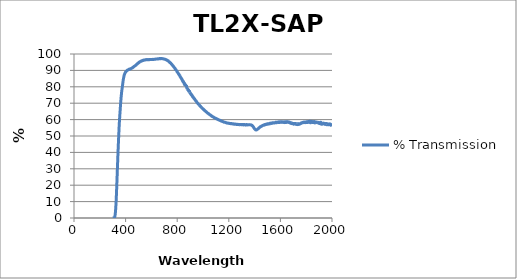
| Category | % Transmission |
|---|---|
| 2000.0 | 56.459 |
| 1999.0 | 56.153 |
| 1998.0 | 57.199 |
| 1997.0 | 56.769 |
| 1996.0 | 56.295 |
| 1995.0 | 56.926 |
| 1994.0 | 56.353 |
| 1993.0 | 56.556 |
| 1992.0 | 56.97 |
| 1991.0 | 56.851 |
| 1990.0 | 56.565 |
| 1989.0 | 57.007 |
| 1988.0 | 56.916 |
| 1987.0 | 56.935 |
| 1986.0 | 57.356 |
| 1985.0 | 56.956 |
| 1984.0 | 56.682 |
| 1983.0 | 57.309 |
| 1982.0 | 57.167 |
| 1981.0 | 57.243 |
| 1980.0 | 57.272 |
| 1979.0 | 57.044 |
| 1978.0 | 56.951 |
| 1977.0 | 57.12 |
| 1976.0 | 56.918 |
| 1975.0 | 57.055 |
| 1974.0 | 57.2 |
| 1973.0 | 57.389 |
| 1972.0 | 56.971 |
| 1971.0 | 56.871 |
| 1970.0 | 57.283 |
| 1969.0 | 57.103 |
| 1968.0 | 57.111 |
| 1967.0 | 57.184 |
| 1966.0 | 56.909 |
| 1965.0 | 57.285 |
| 1964.0 | 57.305 |
| 1963.0 | 57.118 |
| 1962.0 | 57.108 |
| 1961.0 | 57.205 |
| 1960.0 | 57.632 |
| 1959.0 | 57.212 |
| 1958.0 | 57.245 |
| 1957.0 | 56.902 |
| 1956.0 | 57.066 |
| 1955.0 | 57.448 |
| 1954.0 | 57.109 |
| 1953.0 | 57.526 |
| 1952.0 | 57.407 |
| 1951.0 | 57.285 |
| 1950.0 | 58.273 |
| 1949.0 | 57.529 |
| 1948.0 | 57.804 |
| 1947.0 | 57.357 |
| 1946.0 | 57.522 |
| 1945.0 | 57.198 |
| 1944.0 | 57.304 |
| 1943.0 | 57.133 |
| 1942.0 | 57.14 |
| 1941.0 | 57.384 |
| 1940.0 | 57.439 |
| 1939.0 | 57.327 |
| 1938.0 | 57.717 |
| 1937.0 | 57.724 |
| 1936.0 | 57.668 |
| 1935.0 | 57.84 |
| 1934.0 | 57.782 |
| 1933.0 | 56.676 |
| 1932.0 | 57.545 |
| 1931.0 | 57.479 |
| 1930.0 | 57.505 |
| 1929.0 | 58.075 |
| 1928.0 | 58.249 |
| 1927.0 | 57.384 |
| 1926.0 | 57.881 |
| 1925.0 | 57.8 |
| 1924.0 | 56.933 |
| 1923.0 | 57.132 |
| 1922.0 | 57.568 |
| 1921.0 | 57.146 |
| 1920.0 | 57.463 |
| 1919.0 | 57.717 |
| 1918.0 | 57.958 |
| 1917.0 | 57.659 |
| 1916.0 | 58.077 |
| 1915.0 | 57.294 |
| 1914.0 | 58.022 |
| 1913.0 | 58.326 |
| 1912.0 | 57.831 |
| 1911.0 | 57.422 |
| 1910.0 | 57.754 |
| 1909.0 | 57.21 |
| 1908.0 | 58.218 |
| 1907.0 | 58.277 |
| 1906.0 | 57.842 |
| 1905.0 | 57.553 |
| 1904.0 | 57.827 |
| 1903.0 | 57.968 |
| 1902.0 | 58.044 |
| 1901.0 | 58.09 |
| 1900.0 | 57.776 |
| 1899.0 | 58.144 |
| 1898.0 | 58.215 |
| 1897.0 | 57.765 |
| 1896.0 | 58.068 |
| 1895.0 | 58.113 |
| 1894.0 | 58.128 |
| 1893.0 | 58.276 |
| 1892.0 | 58.501 |
| 1891.0 | 57.81 |
| 1890.0 | 58.06 |
| 1889.0 | 58.243 |
| 1888.0 | 58.404 |
| 1887.0 | 58.152 |
| 1886.0 | 58.388 |
| 1885.0 | 58.151 |
| 1884.0 | 58.126 |
| 1883.0 | 58.21 |
| 1882.0 | 58.3 |
| 1881.0 | 58.254 |
| 1880.0 | 58.718 |
| 1879.0 | 57.861 |
| 1878.0 | 57.92 |
| 1877.0 | 58.532 |
| 1876.0 | 58.439 |
| 1875.0 | 58.259 |
| 1874.0 | 58.383 |
| 1873.0 | 58.338 |
| 1872.0 | 58.466 |
| 1871.0 | 58.533 |
| 1870.0 | 58.535 |
| 1869.0 | 58.516 |
| 1868.0 | 58.597 |
| 1867.0 | 57.99 |
| 1866.0 | 58.176 |
| 1865.0 | 58.408 |
| 1864.0 | 58.256 |
| 1863.0 | 58.577 |
| 1862.0 | 58.828 |
| 1861.0 | 58.258 |
| 1860.0 | 58.34 |
| 1859.0 | 58.557 |
| 1858.0 | 58.18 |
| 1857.0 | 58.31 |
| 1856.0 | 58.674 |
| 1855.0 | 58.081 |
| 1854.0 | 58.359 |
| 1853.0 | 58.636 |
| 1852.0 | 58.183 |
| 1851.0 | 58.27 |
| 1850.0 | 58.56 |
| 1849.0 | 58.216 |
| 1848.0 | 58.293 |
| 1847.0 | 58.596 |
| 1846.0 | 58.303 |
| 1845.0 | 58.529 |
| 1844.0 | 58.934 |
| 1843.0 | 58.446 |
| 1842.0 | 58.37 |
| 1841.0 | 58.679 |
| 1840.0 | 58.363 |
| 1839.0 | 58.479 |
| 1838.0 | 58.483 |
| 1837.0 | 58.231 |
| 1836.0 | 58.382 |
| 1835.0 | 58.4 |
| 1834.0 | 58.078 |
| 1833.0 | 58.291 |
| 1832.0 | 58.384 |
| 1831.0 | 58.513 |
| 1830.0 | 58.897 |
| 1829.0 | 59.034 |
| 1828.0 | 58.564 |
| 1827.0 | 58.418 |
| 1826.0 | 58.445 |
| 1825.0 | 58.269 |
| 1824.0 | 58.433 |
| 1823.0 | 58.593 |
| 1822.0 | 58.526 |
| 1821.0 | 58.725 |
| 1820.0 | 58.736 |
| 1819.0 | 58.405 |
| 1818.0 | 58.613 |
| 1817.0 | 58.823 |
| 1816.0 | 58.49 |
| 1815.0 | 58.581 |
| 1814.0 | 58.622 |
| 1813.0 | 58.257 |
| 1812.0 | 58.534 |
| 1811.0 | 58.611 |
| 1810.0 | 58.333 |
| 1809.0 | 58.423 |
| 1808.0 | 58.416 |
| 1807.0 | 58.473 |
| 1806.0 | 58.759 |
| 1805.0 | 58.562 |
| 1804.0 | 58.205 |
| 1803.0 | 58.489 |
| 1802.0 | 58.606 |
| 1801.0 | 58.396 |
| 1800.0 | 58.388 |
| 1799.0 | 58.503 |
| 1798.0 | 58.451 |
| 1797.0 | 58.47 |
| 1796.0 | 58.337 |
| 1795.0 | 58.174 |
| 1794.0 | 58.509 |
| 1793.0 | 58.471 |
| 1792.0 | 58.305 |
| 1791.0 | 58.434 |
| 1790.0 | 58.533 |
| 1789.0 | 58.358 |
| 1788.0 | 58.283 |
| 1787.0 | 58.436 |
| 1786.0 | 58.383 |
| 1785.0 | 58.374 |
| 1784.0 | 58.334 |
| 1783.0 | 58.138 |
| 1782.0 | 58.293 |
| 1781.0 | 58.472 |
| 1780.0 | 58.323 |
| 1779.0 | 58.189 |
| 1778.0 | 58.247 |
| 1777.0 | 58.259 |
| 1776.0 | 58.273 |
| 1775.0 | 58.307 |
| 1774.0 | 58.138 |
| 1773.0 | 58.166 |
| 1772.0 | 58.207 |
| 1771.0 | 58.019 |
| 1770.0 | 58.135 |
| 1769.0 | 58.075 |
| 1768.0 | 57.994 |
| 1767.0 | 57.978 |
| 1766.0 | 58.029 |
| 1765.0 | 57.884 |
| 1764.0 | 58.077 |
| 1763.0 | 57.993 |
| 1762.0 | 57.734 |
| 1761.0 | 57.724 |
| 1760.0 | 57.725 |
| 1759.0 | 57.603 |
| 1758.0 | 57.574 |
| 1757.0 | 57.624 |
| 1756.0 | 57.587 |
| 1755.0 | 57.651 |
| 1754.0 | 57.612 |
| 1753.0 | 57.534 |
| 1752.0 | 57.504 |
| 1751.0 | 57.43 |
| 1750.0 | 57.3 |
| 1749.0 | 57.163 |
| 1748.0 | 57.234 |
| 1747.0 | 57.167 |
| 1746.0 | 57.364 |
| 1745.0 | 57.184 |
| 1744.0 | 57.121 |
| 1743.0 | 57.202 |
| 1742.0 | 57.215 |
| 1741.0 | 57.144 |
| 1740.0 | 57.468 |
| 1739.0 | 57.28 |
| 1738.0 | 57.052 |
| 1737.0 | 57.172 |
| 1736.0 | 57.17 |
| 1735.0 | 57.022 |
| 1734.0 | 57.667 |
| 1733.0 | 57.402 |
| 1732.0 | 57.151 |
| 1731.0 | 57.366 |
| 1730.0 | 57.412 |
| 1729.0 | 56.948 |
| 1728.0 | 57.265 |
| 1727.0 | 57.163 |
| 1726.0 | 57.283 |
| 1725.0 | 57.481 |
| 1724.0 | 57.372 |
| 1723.0 | 57.182 |
| 1722.0 | 57.454 |
| 1721.0 | 57.343 |
| 1720.0 | 57.322 |
| 1719.0 | 57.366 |
| 1718.0 | 57.386 |
| 1717.0 | 57.213 |
| 1716.0 | 57.659 |
| 1715.0 | 57.5 |
| 1714.0 | 57.317 |
| 1713.0 | 57.402 |
| 1712.0 | 57.317 |
| 1711.0 | 57.42 |
| 1710.0 | 57.349 |
| 1709.0 | 57.383 |
| 1708.0 | 57.388 |
| 1707.0 | 57.26 |
| 1706.0 | 57.673 |
| 1705.0 | 57.416 |
| 1704.0 | 57.555 |
| 1703.0 | 57.23 |
| 1702.0 | 57.23 |
| 1701.0 | 57.329 |
| 1700.0 | 57.331 |
| 1699.0 | 57.44 |
| 1698.0 | 57.568 |
| 1697.0 | 57.491 |
| 1696.0 | 57.459 |
| 1695.0 | 57.582 |
| 1694.0 | 57.713 |
| 1693.0 | 57.566 |
| 1692.0 | 57.779 |
| 1691.0 | 57.66 |
| 1690.0 | 57.568 |
| 1689.0 | 57.726 |
| 1688.0 | 57.93 |
| 1687.0 | 57.543 |
| 1686.0 | 57.824 |
| 1685.0 | 57.798 |
| 1684.0 | 57.616 |
| 1683.0 | 57.867 |
| 1682.0 | 58.076 |
| 1681.0 | 57.758 |
| 1680.0 | 58.056 |
| 1679.0 | 58.097 |
| 1678.0 | 58.025 |
| 1677.0 | 57.997 |
| 1676.0 | 58.158 |
| 1675.0 | 57.949 |
| 1674.0 | 58.066 |
| 1673.0 | 58.332 |
| 1672.0 | 58.141 |
| 1671.0 | 58.194 |
| 1670.0 | 58.436 |
| 1669.0 | 58.3 |
| 1668.0 | 58.354 |
| 1667.0 | 58.18 |
| 1666.0 | 58.589 |
| 1665.0 | 58.318 |
| 1664.0 | 58.373 |
| 1663.0 | 58.373 |
| 1662.0 | 58.535 |
| 1661.0 | 58.315 |
| 1660.0 | 58.604 |
| 1659.0 | 58.593 |
| 1658.0 | 58.458 |
| 1657.0 | 58.425 |
| 1656.0 | 58.782 |
| 1655.0 | 58.416 |
| 1654.0 | 58.704 |
| 1653.0 | 58.6 |
| 1652.0 | 58.589 |
| 1651.0 | 58.513 |
| 1650.0 | 58.64 |
| 1649.0 | 58.373 |
| 1648.0 | 58.417 |
| 1647.0 | 58.675 |
| 1646.0 | 58.627 |
| 1645.0 | 58.789 |
| 1644.0 | 58.627 |
| 1643.0 | 58.164 |
| 1642.0 | 58.425 |
| 1641.0 | 58.644 |
| 1640.0 | 58.563 |
| 1639.0 | 58.291 |
| 1638.0 | 58.421 |
| 1637.0 | 58.291 |
| 1636.0 | 58.334 |
| 1635.0 | 58.685 |
| 1634.0 | 58.456 |
| 1633.0 | 58.323 |
| 1632.0 | 58.184 |
| 1631.0 | 58.189 |
| 1630.0 | 58.321 |
| 1629.0 | 58.519 |
| 1628.0 | 58.355 |
| 1627.0 | 58.435 |
| 1626.0 | 58.558 |
| 1625.0 | 58.311 |
| 1624.0 | 58.499 |
| 1623.0 | 58.532 |
| 1622.0 | 58.354 |
| 1621.0 | 58.614 |
| 1620.0 | 58.591 |
| 1619.0 | 58.392 |
| 1618.0 | 58.498 |
| 1617.0 | 58.472 |
| 1616.0 | 58.512 |
| 1615.0 | 58.547 |
| 1614.0 | 58.449 |
| 1613.0 | 58.255 |
| 1612.0 | 58.451 |
| 1611.0 | 58.67 |
| 1610.0 | 58.701 |
| 1609.0 | 58.431 |
| 1608.0 | 58.481 |
| 1607.0 | 58.378 |
| 1606.0 | 58.635 |
| 1605.0 | 58.696 |
| 1604.0 | 58.696 |
| 1603.0 | 58.545 |
| 1602.0 | 58.506 |
| 1601.0 | 58.378 |
| 1600.0 | 58.647 |
| 1599.0 | 58.699 |
| 1598.0 | 58.61 |
| 1597.0 | 58.483 |
| 1596.0 | 58.406 |
| 1595.0 | 58.288 |
| 1594.0 | 58.524 |
| 1593.0 | 58.627 |
| 1592.0 | 58.43 |
| 1591.0 | 58.4 |
| 1590.0 | 58.433 |
| 1589.0 | 58.222 |
| 1588.0 | 58.346 |
| 1587.0 | 58.61 |
| 1586.0 | 58.421 |
| 1585.0 | 58.405 |
| 1584.0 | 58.433 |
| 1583.0 | 58.284 |
| 1582.0 | 58.474 |
| 1581.0 | 58.487 |
| 1580.0 | 58.44 |
| 1579.0 | 58.352 |
| 1578.0 | 58.314 |
| 1577.0 | 58.289 |
| 1576.0 | 58.314 |
| 1575.0 | 58.414 |
| 1574.0 | 58.261 |
| 1573.0 | 58.306 |
| 1572.0 | 58.232 |
| 1571.0 | 58.112 |
| 1570.0 | 58.328 |
| 1569.0 | 58.21 |
| 1568.0 | 58.13 |
| 1567.0 | 58.276 |
| 1566.0 | 58.23 |
| 1565.0 | 58.135 |
| 1564.0 | 58.316 |
| 1563.0 | 58.365 |
| 1562.0 | 58.232 |
| 1561.0 | 58.192 |
| 1560.0 | 58.159 |
| 1559.0 | 58.09 |
| 1558.0 | 58.124 |
| 1557.0 | 58.145 |
| 1556.0 | 58.081 |
| 1555.0 | 58.132 |
| 1554.0 | 58.111 |
| 1553.0 | 57.892 |
| 1552.0 | 58.001 |
| 1551.0 | 58.128 |
| 1550.0 | 57.897 |
| 1549.0 | 57.985 |
| 1548.0 | 57.988 |
| 1547.0 | 57.878 |
| 1546.0 | 58.106 |
| 1545.0 | 58.044 |
| 1544.0 | 58.018 |
| 1543.0 | 58.044 |
| 1542.0 | 58.073 |
| 1541.0 | 57.911 |
| 1540.0 | 58.02 |
| 1539.0 | 58.044 |
| 1538.0 | 57.909 |
| 1537.0 | 57.877 |
| 1536.0 | 57.876 |
| 1535.0 | 57.728 |
| 1534.0 | 57.954 |
| 1533.0 | 57.954 |
| 1532.0 | 57.882 |
| 1531.0 | 57.816 |
| 1530.0 | 57.854 |
| 1529.0 | 57.609 |
| 1528.0 | 57.819 |
| 1527.0 | 57.884 |
| 1526.0 | 57.785 |
| 1525.0 | 57.687 |
| 1524.0 | 57.667 |
| 1523.0 | 57.517 |
| 1522.0 | 57.725 |
| 1521.0 | 57.734 |
| 1520.0 | 57.639 |
| 1519.0 | 57.676 |
| 1518.0 | 57.718 |
| 1517.0 | 57.535 |
| 1516.0 | 57.597 |
| 1515.0 | 57.635 |
| 1514.0 | 57.607 |
| 1513.0 | 57.544 |
| 1512.0 | 57.539 |
| 1511.0 | 57.343 |
| 1510.0 | 57.49 |
| 1509.0 | 57.503 |
| 1508.0 | 57.5 |
| 1507.0 | 57.467 |
| 1506.0 | 57.503 |
| 1505.0 | 57.377 |
| 1504.0 | 57.47 |
| 1503.0 | 57.497 |
| 1502.0 | 57.402 |
| 1501.0 | 57.445 |
| 1500.0 | 57.315 |
| 1499.0 | 57.141 |
| 1498.0 | 57.376 |
| 1497.0 | 57.406 |
| 1496.0 | 57.37 |
| 1495.0 | 57.279 |
| 1494.0 | 57.174 |
| 1493.0 | 57.128 |
| 1492.0 | 57.317 |
| 1491.0 | 57.236 |
| 1490.0 | 57.155 |
| 1489.0 | 57.176 |
| 1488.0 | 57.03 |
| 1487.0 | 56.884 |
| 1486.0 | 57.039 |
| 1485.0 | 57.106 |
| 1484.0 | 57.033 |
| 1483.0 | 57.066 |
| 1482.0 | 56.95 |
| 1481.0 | 56.85 |
| 1480.0 | 57.023 |
| 1479.0 | 56.961 |
| 1478.0 | 56.864 |
| 1477.0 | 56.911 |
| 1476.0 | 56.795 |
| 1475.0 | 56.623 |
| 1474.0 | 56.732 |
| 1473.0 | 56.711 |
| 1472.0 | 56.648 |
| 1471.0 | 56.715 |
| 1470.0 | 56.698 |
| 1469.0 | 56.647 |
| 1468.0 | 56.647 |
| 1467.0 | 56.569 |
| 1466.0 | 56.536 |
| 1465.0 | 56.552 |
| 1464.0 | 56.446 |
| 1463.0 | 56.34 |
| 1462.0 | 56.398 |
| 1461.0 | 56.354 |
| 1460.0 | 56.306 |
| 1459.0 | 56.194 |
| 1458.0 | 56.129 |
| 1457.0 | 56.048 |
| 1456.0 | 56.169 |
| 1455.0 | 56.147 |
| 1454.0 | 56.065 |
| 1453.0 | 56.05 |
| 1452.0 | 55.912 |
| 1451.0 | 55.813 |
| 1450.0 | 55.872 |
| 1449.0 | 55.813 |
| 1448.0 | 55.764 |
| 1447.0 | 55.726 |
| 1446.0 | 55.588 |
| 1445.0 | 55.592 |
| 1444.0 | 55.691 |
| 1443.0 | 55.607 |
| 1442.0 | 55.464 |
| 1441.0 | 55.376 |
| 1440.0 | 55.241 |
| 1439.0 | 55.171 |
| 1438.0 | 55.261 |
| 1437.0 | 55.207 |
| 1436.0 | 55.072 |
| 1435.0 | 54.981 |
| 1434.0 | 54.793 |
| 1433.0 | 54.77 |
| 1432.0 | 54.847 |
| 1431.0 | 54.73 |
| 1430.0 | 54.609 |
| 1429.0 | 54.563 |
| 1428.0 | 54.444 |
| 1427.0 | 54.379 |
| 1426.0 | 54.367 |
| 1425.0 | 54.32 |
| 1424.0 | 54.205 |
| 1423.0 | 54.137 |
| 1422.0 | 54.031 |
| 1421.0 | 53.979 |
| 1420.0 | 54.004 |
| 1419.0 | 53.961 |
| 1418.0 | 53.887 |
| 1417.0 | 53.856 |
| 1416.0 | 53.773 |
| 1415.0 | 53.863 |
| 1414.0 | 53.834 |
| 1413.0 | 53.672 |
| 1412.0 | 53.717 |
| 1411.0 | 53.767 |
| 1410.0 | 53.678 |
| 1409.0 | 53.791 |
| 1408.0 | 53.769 |
| 1407.0 | 53.769 |
| 1406.0 | 53.918 |
| 1405.0 | 53.995 |
| 1404.0 | 53.994 |
| 1403.0 | 54.101 |
| 1402.0 | 54.19 |
| 1401.0 | 54.249 |
| 1400.0 | 54.315 |
| 1399.0 | 54.499 |
| 1398.0 | 54.503 |
| 1397.0 | 54.708 |
| 1396.0 | 54.924 |
| 1395.0 | 54.924 |
| 1394.0 | 55.026 |
| 1393.0 | 55.203 |
| 1392.0 | 55.246 |
| 1391.0 | 55.459 |
| 1390.0 | 55.576 |
| 1389.0 | 55.625 |
| 1388.0 | 55.818 |
| 1387.0 | 55.912 |
| 1386.0 | 55.892 |
| 1385.0 | 56.132 |
| 1384.0 | 56.197 |
| 1383.0 | 56.181 |
| 1382.0 | 56.243 |
| 1381.0 | 56.37 |
| 1380.0 | 56.388 |
| 1379.0 | 56.579 |
| 1378.0 | 56.569 |
| 1377.0 | 56.579 |
| 1376.0 | 56.653 |
| 1375.0 | 56.688 |
| 1374.0 | 56.635 |
| 1373.0 | 56.636 |
| 1372.0 | 56.706 |
| 1371.0 | 56.803 |
| 1370.0 | 56.811 |
| 1369.0 | 56.822 |
| 1368.0 | 56.762 |
| 1367.0 | 56.79 |
| 1366.0 | 56.886 |
| 1365.0 | 56.85 |
| 1364.0 | 56.812 |
| 1363.0 | 56.803 |
| 1362.0 | 56.832 |
| 1361.0 | 56.944 |
| 1360.0 | 56.817 |
| 1359.0 | 56.83 |
| 1358.0 | 56.87 |
| 1357.0 | 56.871 |
| 1356.0 | 56.81 |
| 1355.0 | 56.923 |
| 1354.0 | 56.882 |
| 1353.0 | 56.782 |
| 1352.0 | 56.869 |
| 1351.0 | 56.861 |
| 1350.0 | 56.753 |
| 1349.0 | 56.861 |
| 1348.0 | 56.877 |
| 1347.0 | 56.765 |
| 1346.0 | 56.777 |
| 1345.0 | 56.822 |
| 1344.0 | 56.778 |
| 1343.0 | 56.841 |
| 1342.0 | 56.841 |
| 1341.0 | 56.919 |
| 1340.0 | 56.904 |
| 1339.0 | 56.967 |
| 1338.0 | 57.013 |
| 1337.0 | 57.027 |
| 1336.0 | 56.906 |
| 1335.0 | 56.831 |
| 1334.0 | 56.653 |
| 1333.0 | 56.646 |
| 1332.0 | 56.638 |
| 1331.0 | 56.764 |
| 1330.0 | 56.806 |
| 1329.0 | 56.729 |
| 1328.0 | 56.742 |
| 1327.0 | 56.807 |
| 1326.0 | 56.78 |
| 1325.0 | 56.856 |
| 1324.0 | 56.844 |
| 1323.0 | 56.864 |
| 1322.0 | 57.01 |
| 1321.0 | 56.989 |
| 1320.0 | 56.899 |
| 1319.0 | 56.878 |
| 1318.0 | 56.895 |
| 1317.0 | 56.894 |
| 1316.0 | 56.75 |
| 1315.0 | 56.964 |
| 1314.0 | 56.803 |
| 1313.0 | 56.861 |
| 1312.0 | 56.871 |
| 1311.0 | 56.876 |
| 1310.0 | 56.915 |
| 1309.0 | 56.982 |
| 1308.0 | 56.887 |
| 1307.0 | 56.928 |
| 1306.0 | 56.899 |
| 1305.0 | 56.949 |
| 1304.0 | 56.978 |
| 1303.0 | 56.902 |
| 1302.0 | 56.877 |
| 1301.0 | 56.918 |
| 1300.0 | 56.925 |
| 1299.0 | 56.978 |
| 1298.0 | 56.889 |
| 1297.0 | 56.928 |
| 1296.0 | 56.929 |
| 1295.0 | 56.974 |
| 1294.0 | 57.03 |
| 1293.0 | 57.02 |
| 1292.0 | 57.025 |
| 1291.0 | 57.018 |
| 1290.0 | 56.93 |
| 1289.0 | 57.023 |
| 1288.0 | 56.904 |
| 1287.0 | 56.912 |
| 1286.0 | 56.881 |
| 1285.0 | 56.846 |
| 1284.0 | 56.87 |
| 1283.0 | 56.938 |
| 1282.0 | 56.969 |
| 1281.0 | 56.949 |
| 1280.0 | 56.978 |
| 1279.0 | 57.032 |
| 1278.0 | 56.992 |
| 1277.0 | 56.992 |
| 1276.0 | 57.082 |
| 1275.0 | 57.048 |
| 1274.0 | 56.939 |
| 1273.0 | 57.085 |
| 1272.0 | 56.935 |
| 1271.0 | 57.066 |
| 1270.0 | 57.059 |
| 1269.0 | 57.05 |
| 1268.0 | 57.105 |
| 1267.0 | 57.1 |
| 1266.0 | 57.063 |
| 1265.0 | 57.11 |
| 1264.0 | 57.106 |
| 1263.0 | 57.054 |
| 1262.0 | 57.148 |
| 1261.0 | 57.077 |
| 1260.0 | 57.101 |
| 1259.0 | 57.088 |
| 1258.0 | 57.078 |
| 1257.0 | 57.077 |
| 1256.0 | 57.201 |
| 1255.0 | 57.138 |
| 1254.0 | 57.172 |
| 1253.0 | 57.217 |
| 1252.0 | 57.245 |
| 1251.0 | 57.158 |
| 1250.0 | 57.238 |
| 1249.0 | 57.172 |
| 1248.0 | 57.117 |
| 1247.0 | 57.25 |
| 1246.0 | 57.176 |
| 1245.0 | 57.217 |
| 1244.0 | 57.212 |
| 1243.0 | 57.369 |
| 1242.0 | 57.169 |
| 1241.0 | 57.306 |
| 1240.0 | 57.287 |
| 1239.0 | 57.207 |
| 1238.0 | 57.32 |
| 1237.0 | 57.374 |
| 1236.0 | 57.301 |
| 1235.0 | 57.42 |
| 1234.0 | 57.349 |
| 1233.0 | 57.308 |
| 1232.0 | 57.38 |
| 1231.0 | 57.454 |
| 1230.0 | 57.325 |
| 1229.0 | 57.43 |
| 1228.0 | 57.407 |
| 1227.0 | 57.389 |
| 1226.0 | 57.417 |
| 1225.0 | 57.545 |
| 1224.0 | 57.487 |
| 1223.0 | 57.586 |
| 1222.0 | 57.543 |
| 1221.0 | 57.561 |
| 1220.0 | 57.646 |
| 1219.0 | 57.547 |
| 1218.0 | 57.498 |
| 1217.0 | 57.58 |
| 1216.0 | 57.485 |
| 1215.0 | 57.524 |
| 1214.0 | 57.513 |
| 1213.0 | 57.586 |
| 1212.0 | 57.586 |
| 1211.0 | 57.633 |
| 1210.0 | 57.563 |
| 1209.0 | 57.674 |
| 1208.0 | 57.595 |
| 1207.0 | 57.697 |
| 1206.0 | 57.602 |
| 1205.0 | 57.73 |
| 1204.0 | 57.637 |
| 1203.0 | 57.643 |
| 1202.0 | 57.775 |
| 1201.0 | 57.78 |
| 1200.0 | 57.722 |
| 1199.0 | 57.778 |
| 1198.0 | 57.769 |
| 1197.0 | 57.815 |
| 1196.0 | 57.746 |
| 1195.0 | 57.835 |
| 1194.0 | 57.797 |
| 1193.0 | 57.862 |
| 1192.0 | 57.972 |
| 1191.0 | 57.918 |
| 1190.0 | 57.956 |
| 1189.0 | 57.929 |
| 1188.0 | 57.964 |
| 1187.0 | 57.948 |
| 1186.0 | 57.984 |
| 1185.0 | 58.007 |
| 1184.0 | 57.997 |
| 1183.0 | 58.038 |
| 1182.0 | 57.997 |
| 1181.0 | 57.976 |
| 1180.0 | 58.09 |
| 1179.0 | 58.1 |
| 1178.0 | 58.121 |
| 1177.0 | 58.185 |
| 1176.0 | 58.244 |
| 1175.0 | 58.22 |
| 1174.0 | 58.281 |
| 1173.0 | 58.298 |
| 1172.0 | 58.32 |
| 1171.0 | 58.311 |
| 1170.0 | 58.351 |
| 1169.0 | 58.323 |
| 1168.0 | 58.432 |
| 1167.0 | 58.413 |
| 1166.0 | 58.401 |
| 1165.0 | 58.433 |
| 1164.0 | 58.497 |
| 1163.0 | 58.442 |
| 1162.0 | 58.509 |
| 1161.0 | 58.454 |
| 1160.0 | 58.569 |
| 1159.0 | 58.641 |
| 1158.0 | 58.662 |
| 1157.0 | 58.604 |
| 1156.0 | 58.726 |
| 1155.0 | 58.798 |
| 1154.0 | 58.805 |
| 1153.0 | 58.811 |
| 1152.0 | 58.769 |
| 1151.0 | 58.791 |
| 1150.0 | 58.937 |
| 1149.0 | 59.011 |
| 1148.0 | 59.003 |
| 1147.0 | 59.021 |
| 1146.0 | 59.028 |
| 1145.0 | 59.001 |
| 1144.0 | 59.041 |
| 1143.0 | 59.109 |
| 1142.0 | 59.146 |
| 1141.0 | 59.164 |
| 1140.0 | 59.204 |
| 1139.0 | 59.178 |
| 1138.0 | 59.315 |
| 1137.0 | 59.427 |
| 1136.0 | 59.448 |
| 1135.0 | 59.47 |
| 1134.0 | 59.403 |
| 1133.0 | 59.405 |
| 1132.0 | 59.457 |
| 1131.0 | 59.545 |
| 1130.0 | 59.618 |
| 1129.0 | 59.647 |
| 1128.0 | 59.565 |
| 1127.0 | 59.6 |
| 1126.0 | 59.734 |
| 1125.0 | 59.784 |
| 1124.0 | 59.822 |
| 1123.0 | 59.805 |
| 1122.0 | 59.812 |
| 1121.0 | 59.919 |
| 1120.0 | 59.951 |
| 1119.0 | 59.948 |
| 1118.0 | 59.991 |
| 1117.0 | 60.022 |
| 1116.0 | 60.081 |
| 1115.0 | 60.146 |
| 1114.0 | 60.168 |
| 1113.0 | 60.144 |
| 1112.0 | 60.225 |
| 1111.0 | 60.245 |
| 1110.0 | 60.227 |
| 1109.0 | 60.349 |
| 1108.0 | 60.426 |
| 1107.0 | 60.378 |
| 1106.0 | 60.457 |
| 1105.0 | 60.531 |
| 1104.0 | 60.562 |
| 1103.0 | 60.619 |
| 1102.0 | 60.704 |
| 1101.0 | 60.655 |
| 1100.0 | 60.674 |
| 1099.0 | 60.726 |
| 1098.0 | 60.717 |
| 1097.0 | 60.818 |
| 1096.0 | 60.867 |
| 1095.0 | 60.845 |
| 1094.0 | 60.936 |
| 1093.0 | 60.96 |
| 1092.0 | 60.976 |
| 1091.0 | 61.065 |
| 1090.0 | 61.139 |
| 1089.0 | 61.146 |
| 1088.0 | 61.223 |
| 1087.0 | 61.259 |
| 1086.0 | 61.236 |
| 1085.0 | 61.277 |
| 1084.0 | 61.327 |
| 1083.0 | 61.414 |
| 1082.0 | 61.527 |
| 1081.0 | 61.505 |
| 1080.0 | 61.47 |
| 1079.0 | 61.532 |
| 1078.0 | 61.661 |
| 1077.0 | 61.732 |
| 1076.0 | 61.778 |
| 1075.0 | 61.831 |
| 1074.0 | 61.89 |
| 1073.0 | 61.858 |
| 1072.0 | 61.903 |
| 1071.0 | 62.012 |
| 1070.0 | 61.967 |
| 1069.0 | 61.973 |
| 1068.0 | 62.149 |
| 1067.0 | 62.27 |
| 1066.0 | 62.313 |
| 1065.0 | 62.371 |
| 1064.0 | 62.408 |
| 1063.0 | 62.449 |
| 1062.0 | 62.494 |
| 1061.0 | 62.61 |
| 1060.0 | 62.679 |
| 1059.0 | 62.672 |
| 1058.0 | 62.696 |
| 1057.0 | 62.748 |
| 1056.0 | 62.75 |
| 1055.0 | 62.836 |
| 1054.0 | 62.938 |
| 1053.0 | 63.016 |
| 1052.0 | 63.075 |
| 1051.0 | 63.038 |
| 1050.0 | 63.092 |
| 1049.0 | 63.217 |
| 1048.0 | 63.332 |
| 1047.0 | 63.368 |
| 1046.0 | 63.444 |
| 1045.0 | 63.468 |
| 1044.0 | 63.477 |
| 1043.0 | 63.65 |
| 1042.0 | 63.706 |
| 1041.0 | 63.707 |
| 1040.0 | 63.77 |
| 1039.0 | 63.861 |
| 1038.0 | 63.864 |
| 1037.0 | 63.942 |
| 1036.0 | 63.994 |
| 1035.0 | 63.998 |
| 1034.0 | 64.138 |
| 1033.0 | 64.189 |
| 1032.0 | 64.228 |
| 1031.0 | 64.357 |
| 1030.0 | 64.458 |
| 1029.0 | 64.456 |
| 1028.0 | 64.526 |
| 1027.0 | 64.599 |
| 1026.0 | 64.6 |
| 1025.0 | 64.789 |
| 1024.0 | 64.818 |
| 1023.0 | 64.818 |
| 1022.0 | 64.892 |
| 1021.0 | 64.946 |
| 1020.0 | 64.956 |
| 1019.0 | 65.159 |
| 1018.0 | 65.221 |
| 1017.0 | 65.253 |
| 1016.0 | 65.387 |
| 1015.0 | 65.445 |
| 1014.0 | 65.375 |
| 1013.0 | 65.506 |
| 1012.0 | 65.612 |
| 1011.0 | 65.72 |
| 1010.0 | 65.852 |
| 1009.0 | 65.897 |
| 1008.0 | 65.845 |
| 1007.0 | 66.039 |
| 1006.0 | 66.097 |
| 1005.0 | 66.072 |
| 1004.0 | 66.16 |
| 1003.0 | 66.165 |
| 1002.0 | 66.288 |
| 1001.0 | 66.549 |
| 1000.0 | 66.554 |
| 999.0 | 66.498 |
| 998.0 | 66.663 |
| 997.0 | 66.778 |
| 996.0 | 66.72 |
| 995.0 | 66.938 |
| 994.0 | 66.966 |
| 993.0 | 67.051 |
| 992.0 | 67.135 |
| 991.0 | 67.224 |
| 990.0 | 67.218 |
| 989.0 | 67.419 |
| 988.0 | 67.494 |
| 987.0 | 67.524 |
| 986.0 | 67.617 |
| 985.0 | 67.662 |
| 984.0 | 67.732 |
| 983.0 | 67.892 |
| 982.0 | 67.9 |
| 981.0 | 67.946 |
| 980.0 | 68.174 |
| 979.0 | 68.158 |
| 978.0 | 68.174 |
| 977.0 | 68.503 |
| 976.0 | 68.463 |
| 975.0 | 68.426 |
| 974.0 | 68.58 |
| 973.0 | 68.565 |
| 972.0 | 68.725 |
| 971.0 | 68.909 |
| 970.0 | 68.963 |
| 969.0 | 68.99 |
| 968.0 | 69.173 |
| 967.0 | 69.127 |
| 966.0 | 69.273 |
| 965.0 | 69.381 |
| 964.0 | 69.44 |
| 963.0 | 69.506 |
| 962.0 | 69.747 |
| 961.0 | 69.739 |
| 960.0 | 69.741 |
| 959.0 | 70.04 |
| 958.0 | 70.05 |
| 957.0 | 70.144 |
| 956.0 | 70.279 |
| 955.0 | 70.329 |
| 954.0 | 70.37 |
| 953.0 | 70.662 |
| 952.0 | 70.632 |
| 951.0 | 70.687 |
| 950.0 | 71.099 |
| 949.0 | 70.874 |
| 948.0 | 70.994 |
| 947.0 | 71.345 |
| 946.0 | 71.324 |
| 945.0 | 71.315 |
| 944.0 | 71.423 |
| 943.0 | 71.54 |
| 942.0 | 71.548 |
| 941.0 | 71.757 |
| 940.0 | 71.98 |
| 939.0 | 71.911 |
| 938.0 | 72.239 |
| 937.0 | 72.361 |
| 936.0 | 72.352 |
| 935.0 | 72.65 |
| 934.0 | 72.449 |
| 933.0 | 72.711 |
| 932.0 | 72.952 |
| 931.0 | 72.762 |
| 930.0 | 72.831 |
| 929.0 | 73.135 |
| 928.0 | 73.172 |
| 927.0 | 73.174 |
| 926.0 | 73.473 |
| 925.0 | 73.383 |
| 924.0 | 73.901 |
| 923.0 | 73.8 |
| 922.0 | 73.716 |
| 921.0 | 73.663 |
| 920.0 | 74.073 |
| 919.0 | 74.255 |
| 918.0 | 74.144 |
| 917.0 | 74.49 |
| 916.0 | 74.661 |
| 915.0 | 74.454 |
| 914.0 | 75.02 |
| 913.0 | 74.523 |
| 912.0 | 75.06 |
| 911.0 | 75.689 |
| 910.0 | 75.138 |
| 909.0 | 75.328 |
| 908.0 | 75.449 |
| 907.0 | 75.251 |
| 906.0 | 75.543 |
| 905.0 | 75.802 |
| 904.0 | 75.728 |
| 903.0 | 75.827 |
| 902.0 | 76.344 |
| 901.0 | 76.262 |
| 900.0 | 76.314 |
| 899.0 | 76.176 |
| 898.0 | 76.486 |
| 897.0 | 76.703 |
| 896.0 | 77.234 |
| 895.0 | 77.029 |
| 894.0 | 76.606 |
| 893.0 | 77.398 |
| 892.0 | 77.26 |
| 891.0 | 77.452 |
| 890.0 | 77.517 |
| 889.0 | 77.39 |
| 888.0 | 77.586 |
| 887.0 | 78.504 |
| 886.0 | 77.906 |
| 885.0 | 77.78 |
| 884.0 | 78.811 |
| 883.0 | 78.547 |
| 882.0 | 78.25 |
| 881.0 | 78.658 |
| 880.0 | 78.488 |
| 879.0 | 79.278 |
| 878.0 | 79.207 |
| 877.0 | 78.662 |
| 876.0 | 78.929 |
| 875.0 | 78.857 |
| 874.0 | 79.753 |
| 873.0 | 80.078 |
| 872.0 | 79.695 |
| 871.0 | 80.892 |
| 870.0 | 80.025 |
| 869.0 | 80.203 |
| 868.0 | 80.582 |
| 867.0 | 80.893 |
| 866.0 | 80.438 |
| 865.0 | 81.355 |
| 864.0 | 80.825 |
| 863.0 | 81.014 |
| 862.0 | 81.461 |
| 861.0 | 80.708 |
| 860.0 | 81.77 |
| 859.0 | 81.457 |
| 858.0 | 81.876 |
| 857.0 | 82.003 |
| 856.0 | 82.067 |
| 855.0 | 82.277 |
| 854.0 | 81.927 |
| 853.0 | 82.099 |
| 852.0 | 82.346 |
| 851.0 | 82.469 |
| 850.0 | 82.662 |
| 849.0 | 83.007 |
| 848.0 | 82.841 |
| 847.0 | 83.387 |
| 846.0 | 83.027 |
| 845.0 | 83.451 |
| 844.0 | 83.6 |
| 843.0 | 83.372 |
| 842.0 | 83.902 |
| 841.0 | 83.766 |
| 840.0 | 84.054 |
| 839.0 | 84.141 |
| 838.0 | 84.225 |
| 837.0 | 84.602 |
| 836.0 | 84.46 |
| 835.0 | 84.684 |
| 834.0 | 84.764 |
| 833.0 | 84.913 |
| 832.0 | 85.296 |
| 831.0 | 85.149 |
| 830.0 | 85.468 |
| 829.0 | 85.431 |
| 828.0 | 85.54 |
| 827.0 | 85.592 |
| 826.0 | 85.915 |
| 825.0 | 85.913 |
| 824.0 | 86.038 |
| 823.0 | 86.285 |
| 822.0 | 86.397 |
| 821.0 | 86.631 |
| 820.0 | 86.928 |
| 819.0 | 86.883 |
| 818.0 | 86.856 |
| 817.0 | 87.241 |
| 816.0 | 87.385 |
| 815.0 | 87.277 |
| 814.0 | 87.627 |
| 813.0 | 87.581 |
| 812.0 | 87.707 |
| 811.0 | 87.777 |
| 810.0 | 87.792 |
| 809.0 | 88.084 |
| 808.0 | 88.128 |
| 807.0 | 88.349 |
| 806.0 | 88.41 |
| 805.0 | 88.413 |
| 804.0 | 88.622 |
| 803.0 | 88.75 |
| 802.0 | 88.972 |
| 801.0 | 88.938 |
| 800.0 | 89.2 |
| 799.0 | 89.105 |
| 798.0 | 89.492 |
| 797.0 | 89.645 |
| 796.0 | 89.702 |
| 795.0 | 89.886 |
| 794.0 | 89.933 |
| 793.0 | 90.034 |
| 792.0 | 90.166 |
| 791.0 | 90.158 |
| 790.0 | 90.41 |
| 789.0 | 90.519 |
| 788.0 | 90.588 |
| 787.0 | 90.686 |
| 786.0 | 90.81 |
| 785.0 | 90.979 |
| 784.0 | 91.249 |
| 783.0 | 90.993 |
| 782.0 | 91.207 |
| 781.0 | 91.454 |
| 780.0 | 91.606 |
| 779.0 | 91.626 |
| 778.0 | 91.679 |
| 777.0 | 91.774 |
| 776.0 | 91.869 |
| 775.0 | 91.987 |
| 774.0 | 92.038 |
| 773.0 | 92.236 |
| 772.0 | 92.27 |
| 771.0 | 92.352 |
| 770.0 | 92.432 |
| 769.0 | 92.527 |
| 768.0 | 92.832 |
| 767.0 | 92.862 |
| 766.0 | 92.93 |
| 765.0 | 92.983 |
| 764.0 | 93.001 |
| 763.0 | 93.245 |
| 762.0 | 93.337 |
| 761.0 | 93.399 |
| 760.0 | 93.517 |
| 759.0 | 93.563 |
| 758.0 | 93.57 |
| 757.0 | 93.833 |
| 756.0 | 93.888 |
| 755.0 | 93.9 |
| 754.0 | 93.966 |
| 753.0 | 94.022 |
| 752.0 | 94.147 |
| 751.0 | 94.228 |
| 750.0 | 94.379 |
| 749.0 | 94.557 |
| 748.0 | 94.54 |
| 747.0 | 94.545 |
| 746.0 | 94.689 |
| 745.0 | 94.668 |
| 744.0 | 94.727 |
| 743.0 | 94.887 |
| 742.0 | 94.848 |
| 741.0 | 95.044 |
| 740.0 | 95.12 |
| 739.0 | 95.119 |
| 738.0 | 95.149 |
| 737.0 | 95.273 |
| 736.0 | 95.398 |
| 735.0 | 95.403 |
| 734.0 | 95.433 |
| 733.0 | 95.584 |
| 732.0 | 95.566 |
| 731.0 | 95.715 |
| 730.0 | 95.89 |
| 729.0 | 95.843 |
| 728.0 | 95.88 |
| 727.0 | 95.955 |
| 726.0 | 96.047 |
| 725.0 | 96.026 |
| 724.0 | 96.02 |
| 723.0 | 96.061 |
| 722.0 | 96.158 |
| 721.0 | 96.283 |
| 720.0 | 96.293 |
| 719.0 | 96.298 |
| 718.0 | 96.421 |
| 717.0 | 96.461 |
| 716.0 | 96.486 |
| 715.0 | 96.499 |
| 714.0 | 96.507 |
| 713.0 | 96.518 |
| 712.0 | 96.496 |
| 711.0 | 96.585 |
| 710.0 | 96.625 |
| 709.0 | 96.699 |
| 708.0 | 96.711 |
| 707.0 | 96.771 |
| 706.0 | 96.798 |
| 705.0 | 96.798 |
| 704.0 | 96.777 |
| 703.0 | 96.792 |
| 702.0 | 96.881 |
| 701.0 | 96.922 |
| 700.0 | 96.889 |
| 699.0 | 96.869 |
| 698.0 | 96.912 |
| 697.0 | 96.998 |
| 696.0 | 97.014 |
| 695.0 | 96.996 |
| 694.0 | 97.006 |
| 693.0 | 97.01 |
| 692.0 | 97.056 |
| 691.0 | 97.128 |
| 690.0 | 97.089 |
| 689.0 | 97.065 |
| 688.0 | 97.059 |
| 687.0 | 97.124 |
| 686.0 | 97.155 |
| 685.0 | 97.163 |
| 684.0 | 97.166 |
| 683.0 | 97.207 |
| 682.0 | 97.245 |
| 681.0 | 97.278 |
| 680.0 | 97.262 |
| 679.0 | 97.168 |
| 678.0 | 97.163 |
| 677.0 | 97.232 |
| 676.0 | 97.232 |
| 675.0 | 97.195 |
| 674.0 | 97.22 |
| 673.0 | 97.215 |
| 672.0 | 97.189 |
| 671.0 | 97.135 |
| 670.0 | 97.151 |
| 669.0 | 97.225 |
| 668.0 | 97.191 |
| 667.0 | 97.122 |
| 666.0 | 97.149 |
| 665.0 | 97.2 |
| 664.0 | 97.248 |
| 663.0 | 97.195 |
| 662.0 | 97.139 |
| 661.0 | 97.174 |
| 660.0 | 97.159 |
| 659.0 | 97.149 |
| 658.0 | 97.172 |
| 657.0 | 97.15 |
| 656.0 | 97.017 |
| 655.0 | 97.001 |
| 654.0 | 97.093 |
| 653.0 | 97.12 |
| 652.0 | 97.063 |
| 651.0 | 97.116 |
| 650.0 | 97.097 |
| 649.0 | 97.001 |
| 648.0 | 97.009 |
| 647.0 | 97.017 |
| 646.0 | 96.943 |
| 645.0 | 96.937 |
| 644.0 | 96.939 |
| 643.0 | 96.985 |
| 642.0 | 96.978 |
| 641.0 | 96.902 |
| 640.0 | 96.921 |
| 639.0 | 96.961 |
| 638.0 | 96.894 |
| 637.0 | 96.896 |
| 636.0 | 96.907 |
| 635.0 | 96.864 |
| 634.0 | 96.861 |
| 633.0 | 96.874 |
| 632.0 | 96.84 |
| 631.0 | 96.825 |
| 630.0 | 96.904 |
| 629.0 | 96.804 |
| 628.0 | 96.809 |
| 627.0 | 96.789 |
| 626.0 | 96.816 |
| 625.0 | 96.812 |
| 624.0 | 96.795 |
| 623.0 | 96.797 |
| 622.0 | 96.775 |
| 621.0 | 96.735 |
| 620.0 | 96.739 |
| 619.0 | 96.681 |
| 618.0 | 96.636 |
| 617.0 | 96.674 |
| 616.0 | 96.639 |
| 615.0 | 96.633 |
| 614.0 | 96.706 |
| 613.0 | 96.749 |
| 612.0 | 96.71 |
| 611.0 | 96.673 |
| 610.0 | 96.663 |
| 609.0 | 96.703 |
| 608.0 | 96.646 |
| 607.0 | 96.595 |
| 606.0 | 96.68 |
| 605.0 | 96.726 |
| 604.0 | 96.689 |
| 603.0 | 96.673 |
| 602.0 | 96.617 |
| 601.0 | 96.635 |
| 600.0 | 96.669 |
| 599.0 | 96.622 |
| 598.0 | 96.658 |
| 597.0 | 96.598 |
| 596.0 | 96.607 |
| 595.0 | 96.635 |
| 594.0 | 96.657 |
| 593.0 | 96.638 |
| 592.0 | 96.661 |
| 591.0 | 96.708 |
| 590.0 | 96.648 |
| 589.0 | 96.622 |
| 588.0 | 96.643 |
| 587.0 | 96.581 |
| 586.0 | 96.551 |
| 585.0 | 96.645 |
| 584.0 | 96.571 |
| 583.0 | 96.611 |
| 582.0 | 96.58 |
| 581.0 | 96.562 |
| 580.0 | 96.609 |
| 579.0 | 96.547 |
| 578.0 | 96.503 |
| 577.0 | 96.499 |
| 576.0 | 96.55 |
| 575.0 | 96.534 |
| 574.0 | 96.592 |
| 573.0 | 96.543 |
| 572.0 | 96.498 |
| 571.0 | 96.602 |
| 570.0 | 96.701 |
| 569.0 | 96.577 |
| 568.0 | 96.553 |
| 567.0 | 96.597 |
| 566.0 | 96.512 |
| 565.0 | 96.63 |
| 564.0 | 96.562 |
| 563.0 | 96.567 |
| 562.0 | 96.506 |
| 561.0 | 96.491 |
| 560.0 | 96.453 |
| 559.0 | 96.557 |
| 558.0 | 96.469 |
| 557.0 | 96.583 |
| 556.0 | 96.501 |
| 555.0 | 96.537 |
| 554.0 | 96.418 |
| 553.0 | 96.462 |
| 552.0 | 96.357 |
| 551.0 | 96.422 |
| 550.0 | 96.356 |
| 549.0 | 96.294 |
| 548.0 | 96.256 |
| 547.0 | 96.318 |
| 546.0 | 96.299 |
| 545.0 | 96.353 |
| 544.0 | 96.295 |
| 543.0 | 96.309 |
| 542.0 | 96.167 |
| 541.0 | 96.32 |
| 540.0 | 96.204 |
| 539.0 | 96.265 |
| 538.0 | 96.226 |
| 537.0 | 96.104 |
| 536.0 | 96.058 |
| 535.0 | 96.097 |
| 534.0 | 95.975 |
| 533.0 | 96.13 |
| 532.0 | 96.017 |
| 531.0 | 96.063 |
| 530.0 | 95.85 |
| 529.0 | 95.98 |
| 528.0 | 95.92 |
| 527.0 | 95.878 |
| 526.0 | 95.878 |
| 525.0 | 95.809 |
| 524.0 | 95.741 |
| 523.0 | 95.744 |
| 522.0 | 95.703 |
| 521.0 | 95.752 |
| 520.0 | 95.578 |
| 519.0 | 95.526 |
| 518.0 | 95.522 |
| 517.0 | 95.493 |
| 516.0 | 95.416 |
| 515.0 | 95.48 |
| 514.0 | 95.384 |
| 513.0 | 95.391 |
| 512.0 | 95.301 |
| 511.0 | 95.286 |
| 510.0 | 95.081 |
| 509.0 | 95.131 |
| 508.0 | 95.147 |
| 507.0 | 95.052 |
| 506.0 | 94.882 |
| 505.0 | 94.898 |
| 504.0 | 94.779 |
| 503.0 | 94.869 |
| 502.0 | 94.795 |
| 501.0 | 94.674 |
| 500.0 | 94.512 |
| 499.0 | 94.638 |
| 498.0 | 94.528 |
| 497.0 | 94.389 |
| 496.0 | 94.346 |
| 495.0 | 94.255 |
| 494.0 | 94.16 |
| 493.0 | 94.039 |
| 492.0 | 94.154 |
| 491.0 | 93.855 |
| 490.0 | 94.024 |
| 489.0 | 93.911 |
| 488.0 | 93.815 |
| 487.0 | 93.672 |
| 486.0 | 93.635 |
| 485.0 | 93.652 |
| 484.0 | 93.486 |
| 483.0 | 93.428 |
| 482.0 | 93.329 |
| 481.0 | 93.201 |
| 480.0 | 93.219 |
| 479.0 | 93.239 |
| 478.0 | 93.087 |
| 477.0 | 93 |
| 476.0 | 92.974 |
| 475.0 | 92.908 |
| 474.0 | 92.876 |
| 473.0 | 92.796 |
| 472.0 | 92.761 |
| 471.0 | 92.664 |
| 470.0 | 92.6 |
| 469.0 | 92.52 |
| 468.0 | 92.492 |
| 467.0 | 92.535 |
| 466.0 | 92.381 |
| 465.0 | 92.385 |
| 464.0 | 92.254 |
| 463.0 | 92.199 |
| 462.0 | 92.179 |
| 461.0 | 92.024 |
| 460.0 | 92.069 |
| 459.0 | 92.005 |
| 458.0 | 91.839 |
| 457.0 | 91.746 |
| 456.0 | 91.786 |
| 455.0 | 91.762 |
| 454.0 | 91.726 |
| 453.0 | 91.656 |
| 452.0 | 91.564 |
| 451.0 | 91.44 |
| 450.0 | 91.504 |
| 449.0 | 91.433 |
| 448.0 | 91.348 |
| 447.0 | 91.349 |
| 446.0 | 91.21 |
| 445.0 | 91.196 |
| 444.0 | 91.238 |
| 443.0 | 91.148 |
| 442.0 | 91.127 |
| 441.0 | 91.103 |
| 440.0 | 91.046 |
| 439.0 | 90.965 |
| 438.0 | 90.888 |
| 437.0 | 90.9 |
| 436.0 | 90.823 |
| 435.0 | 90.834 |
| 434.0 | 90.892 |
| 433.0 | 90.797 |
| 432.0 | 90.864 |
| 431.0 | 90.685 |
| 430.0 | 90.682 |
| 429.0 | 90.657 |
| 428.0 | 90.697 |
| 427.0 | 90.706 |
| 426.0 | 90.704 |
| 425.0 | 90.629 |
| 424.0 | 90.521 |
| 423.0 | 90.456 |
| 422.0 | 90.471 |
| 421.0 | 90.446 |
| 420.0 | 90.381 |
| 419.0 | 90.308 |
| 418.0 | 90.263 |
| 417.0 | 90.176 |
| 416.0 | 90.145 |
| 415.0 | 90.116 |
| 414.0 | 90.127 |
| 413.0 | 90.14 |
| 412.0 | 90.002 |
| 411.0 | 90.006 |
| 410.0 | 89.92 |
| 409.0 | 89.806 |
| 408.0 | 89.737 |
| 407.0 | 89.611 |
| 406.0 | 89.514 |
| 405.0 | 89.529 |
| 404.0 | 89.349 |
| 403.0 | 89.215 |
| 402.0 | 89.226 |
| 401.0 | 89.096 |
| 400.0 | 89.031 |
| 399.0 | 88.955 |
| 398.0 | 88.79 |
| 397.0 | 88.568 |
| 396.0 | 88.46 |
| 395.0 | 88.263 |
| 394.0 | 88.168 |
| 393.0 | 87.968 |
| 392.0 | 87.686 |
| 391.0 | 87.481 |
| 390.0 | 87.345 |
| 389.0 | 87.008 |
| 388.0 | 86.805 |
| 387.0 | 86.352 |
| 386.0 | 85.983 |
| 385.0 | 85.517 |
| 384.0 | 85.213 |
| 383.0 | 84.817 |
| 382.0 | 84.343 |
| 381.0 | 83.781 |
| 380.0 | 83.227 |
| 379.0 | 82.643 |
| 378.0 | 82.099 |
| 377.0 | 81.295 |
| 376.0 | 80.916 |
| 375.0 | 80.265 |
| 374.0 | 79.547 |
| 373.0 | 79.04 |
| 372.0 | 78.425 |
| 371.0 | 77.908 |
| 370.0 | 77.22 |
| 369.0 | 76.572 |
| 368.0 | 75.793 |
| 367.0 | 75.05 |
| 366.0 | 74.255 |
| 365.0 | 73.435 |
| 364.0 | 72.451 |
| 363.0 | 71.495 |
| 362.0 | 70.325 |
| 361.0 | 69.409 |
| 360.0 | 68.272 |
| 359.0 | 67.069 |
| 358.0 | 65.814 |
| 357.0 | 64.795 |
| 356.0 | 63.684 |
| 355.0 | 62.444 |
| 354.0 | 61.213 |
| 353.0 | 60.021 |
| 352.0 | 58.715 |
| 351.0 | 57.355 |
| 350.0 | 55.9 |
| 349.0 | 54.168 |
| 348.0 | 52.495 |
| 347.0 | 50.789 |
| 346.0 | 49.044 |
| 345.0 | 47.238 |
| 344.0 | 45.406 |
| 343.0 | 43.611 |
| 342.0 | 41.701 |
| 341.0 | 39.752 |
| 340.0 | 37.683 |
| 339.0 | 35.525 |
| 338.0 | 33.39 |
| 337.0 | 31.256 |
| 336.0 | 29.111 |
| 335.0 | 26.998 |
| 334.0 | 24.845 |
| 333.0 | 22.714 |
| 332.0 | 20.603 |
| 331.0 | 18.491 |
| 330.0 | 16.499 |
| 329.0 | 14.556 |
| 328.0 | 12.66 |
| 327.0 | 10.956 |
| 326.0 | 9.384 |
| 325.0 | 7.94 |
| 324.0 | 6.641 |
| 323.0 | 5.437 |
| 322.0 | 4.386 |
| 321.0 | 3.464 |
| 320.0 | 2.685 |
| 319.0 | 2.022 |
| 318.0 | 1.485 |
| 317.0 | 1.058 |
| 316.0 | 0.727 |
| 315.0 | 0.505 |
| 314.0 | 0.343 |
| 313.0 | 0.233 |
| 312.0 | 0.143 |
| 311.0 | 0.103 |
| 310.0 | 0.083 |
| 309.0 | 0.073 |
| 308.0 | 0.061 |
| 307.0 | 0.061 |
| 306.0 | 0.055 |
| 305.0 | 0.034 |
| 304.0 | 0.034 |
| 303.0 | 0.035 |
| 302.0 | 0.042 |
| 301.0 | 0.066 |
| 300.0 | 0.058 |